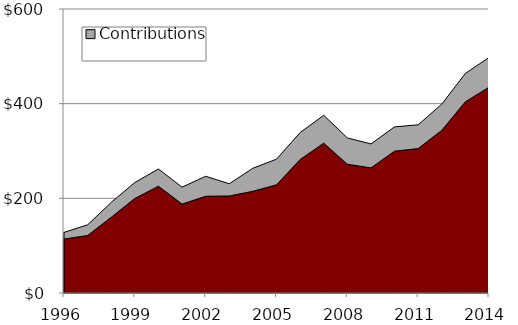
| Category | Rollovers | Contributions |
|---|---|---|
| 1996.0 | 114 | 14.1 |
| 1997.0 | 121.5 | 22.5 |
| 1998.0 | 160 | 31.4 |
| 1999.0 | 199.9 | 33.5 |
| 2000.0 | 225.6 | 36.4 |
| 2001.0 | 187.8 | 35.8 |
| 2002.0 | 204.4 | 42.2 |
| 2003.0 | 205 | 25.8 |
| 2004.0 | 214.9 | 48.7 |
| 2005.0 | 228.5 | 54.3 |
| 2006.0 | 282 | 56.9 |
| 2007.0 | 316.6 | 58.8 |
| 2008.0 | 272.1 | 55.6 |
| 2009.0 | 264.3 | 50.6 |
| 2010.0 | 299.7 | 51.3 |
| 2011.0 | 305.1 | 50.2 |
| 2012.0 | 343.8 | 55.2 |
| 2013.0 | 404 | 59.9 |
| 2014.0 | 434.8 | 62.8 |